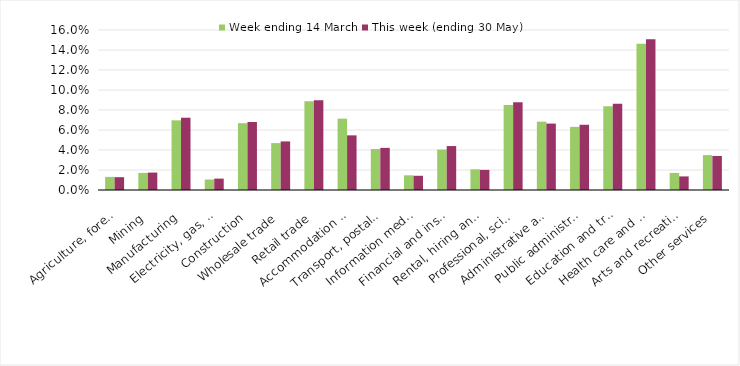
| Category | Week ending 14 March | This week (ending 30 May) |
|---|---|---|
| Agriculture, forestry and fishing | 0.013 | 0.013 |
| Mining | 0.017 | 0.017 |
| Manufacturing | 0.07 | 0.072 |
| Electricity, gas, water and waste services | 0.01 | 0.011 |
| Construction | 0.067 | 0.068 |
| Wholesale trade | 0.047 | 0.049 |
| Retail trade | 0.089 | 0.09 |
| Accommodation and food services | 0.071 | 0.055 |
| Transport, postal and warehousing | 0.041 | 0.042 |
| Information media and telecommunications | 0.015 | 0.014 |
| Financial and insurance services | 0.04 | 0.044 |
| Rental, hiring and real estate services | 0.021 | 0.02 |
| Professional, scientific and technical services | 0.085 | 0.088 |
| Administrative and support services | 0.068 | 0.066 |
| Public administration and safety | 0.063 | 0.065 |
| Education and training | 0.084 | 0.086 |
| Health care and social assistance | 0.146 | 0.151 |
| Arts and recreation services | 0.017 | 0.014 |
| Other services | 0.035 | 0.034 |